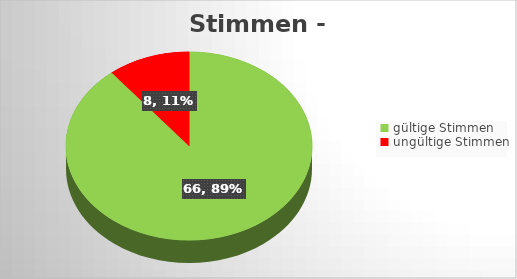
| Category | Series 0 |
|---|---|
| gültige Stimmen | 66 |
| ungültige Stimmen | 8 |